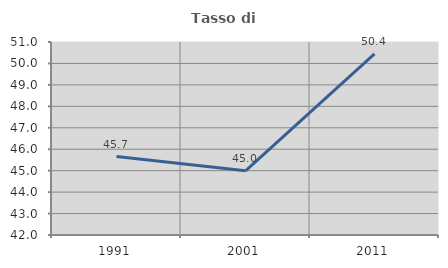
| Category | Tasso di occupazione   |
|---|---|
| 1991.0 | 45.659 |
| 2001.0 | 44.993 |
| 2011.0 | 50.442 |